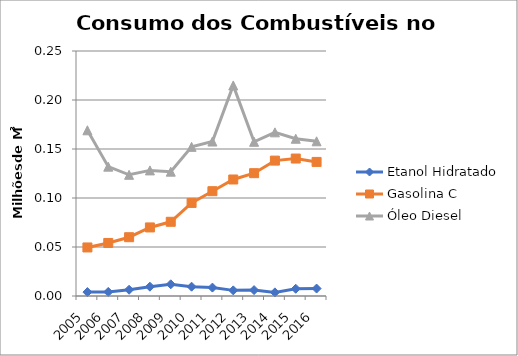
| Category | Etanol Hidratado | Gasolina C | Óleo Diesel |
|---|---|---|---|
| 2005.0 | 3999.534 | 49531.644 | 169085.83 |
| 2006.0 | 4135.926 | 54125.469 | 131981.482 |
| 2007.0 | 6373.692 | 59986.728 | 123674.458 |
| 2008.0 | 9511.65 | 69961.945 | 128170.735 |
| 2009.0 | 11952.007 | 75724.203 | 126871.822 |
| 2010.0 | 9494.532 | 94983.801 | 152199.167 |
| 2011.0 | 8584.56 | 106948.783 | 157630.986 |
| 2012.0 | 5745.497 | 118891.75 | 214874.337 |
| 2013.0 | 6024.83 | 125329.986 | 157363.623 |
| 2014.0 | 3699.015 | 138151.75 | 166990.189 |
| 2015.0 | 7384.5 | 140258.84 | 160460.602 |
| 2016.0 | 7603.707 | 136817.744 | 157852.093 |